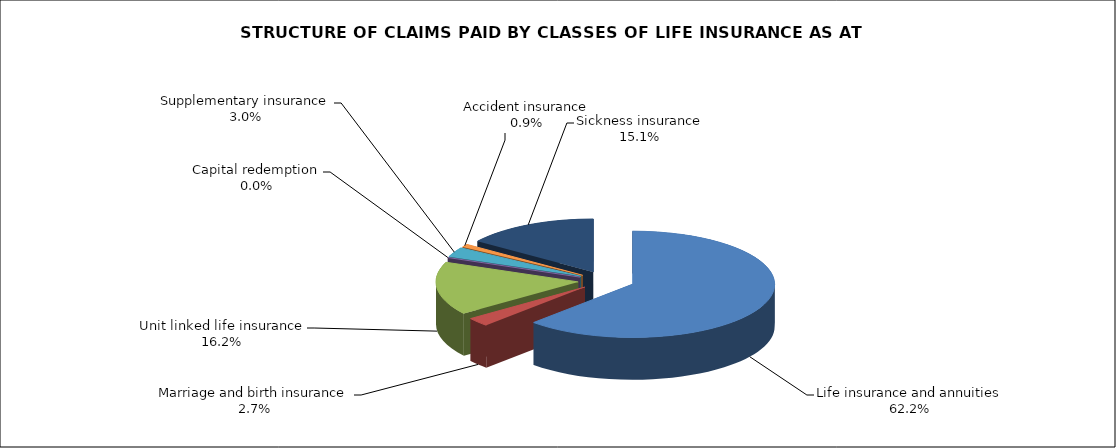
| Category | Life insurance and annuities |
|---|---|
| Life insurance and annuities | 146725289.974 |
| Marriage and birth insurance | 6266162.377 |
| Unit linked life insurance | 38094395.489 |
| Capital redemption | 0 |
| Supplementary insurance | 6980352.064 |
| Accident insurance | 2079604.71 |
| Sickness insurance | 35697768.994 |